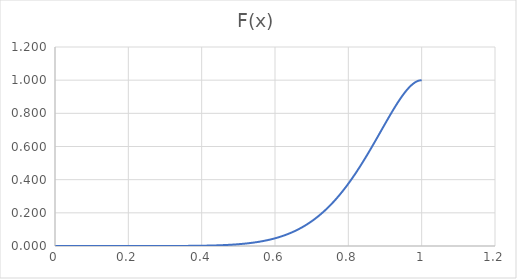
| Category | Series 0 |
|---|---|
| 0.0 | 0 |
| 0.01 | 0 |
| 0.02 | 0 |
| 0.03 | 0 |
| 0.04 | 0 |
| 0.05 | 0 |
| 0.06 | 0 |
| 0.07 | 0 |
| 0.08 | 0 |
| 0.09 | 0 |
| 0.1 | 0 |
| 0.11 | 0 |
| 0.12 | 0 |
| 0.13 | 0 |
| 0.14 | 0 |
| 0.15 | 0 |
| 0.16 | 0 |
| 0.17 | 0 |
| 0.18 | 0 |
| 0.19 | 0 |
| 0.2 | 0 |
| 0.21 | 0 |
| 0.22 | 0 |
| 0.23 | 0 |
| 0.24 | 0 |
| 0.25 | 0 |
| 0.26 | 0 |
| 0.27 | 0 |
| 0.28 | 0 |
| 0.29 | 0 |
| 0.3 | 0 |
| 0.31 | 0 |
| 0.32 | 0 |
| 0.33 | 0 |
| 0.34 | 0 |
| 0.35 | 0.001 |
| 0.36 | 0.001 |
| 0.37 | 0.001 |
| 0.38 | 0.001 |
| 0.39 | 0.001 |
| 0.4 | 0.002 |
| 0.41 | 0.002 |
| 0.42 | 0.003 |
| 0.43 | 0.003 |
| 0.44 | 0.004 |
| 0.45 | 0.005 |
| 0.46 | 0.005 |
| 0.47 | 0.006 |
| 0.48 | 0.008 |
| 0.49 | 0.009 |
| 0.5 | 0.011 |
| 0.51 | 0.013 |
| 0.52 | 0.015 |
| 0.53 | 0.017 |
| 0.54 | 0.02 |
| 0.55 | 0.023 |
| 0.56 | 0.027 |
| 0.57 | 0.031 |
| 0.58 | 0.036 |
| 0.59 | 0.041 |
| 0.6 | 0.046 |
| 0.61 | 0.053 |
| 0.62 | 0.06 |
| 0.63 | 0.068 |
| 0.64 | 0.076 |
| 0.65 | 0.086 |
| 0.66 | 0.096 |
| 0.67 | 0.108 |
| 0.68 | 0.121 |
| 0.69 | 0.134 |
| 0.7 | 0.149 |
| 0.71 | 0.166 |
| 0.72 | 0.183 |
| 0.73 | 0.202 |
| 0.74 | 0.222 |
| 0.75 | 0.244 |
| 0.76 | 0.267 |
| 0.77 | 0.292 |
| 0.78 | 0.318 |
| 0.79 | 0.346 |
| 0.8 | 0.376 |
| 0.81 | 0.407 |
| 0.82 | 0.439 |
| 0.83 | 0.473 |
| 0.84 | 0.508 |
| 0.85 | 0.544 |
| 0.86 | 0.582 |
| 0.87 | 0.62 |
| 0.88 | 0.658 |
| 0.89 | 0.697 |
| 0.9 | 0.736 |
| 0.91 | 0.775 |
| 0.92 | 0.812 |
| 0.93 | 0.848 |
| 0.94 | 0.882 |
| 0.95 | 0.914 |
| 0.96 | 0.942 |
| 0.97 | 0.965 |
| 0.98 | 0.984 |
| 0.99 | 0.996 |
| 1.0 | 1 |